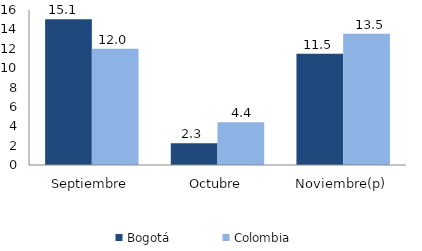
| Category | Bogotá | Colombia |
|---|---|---|
| Septiembre | 15.057 | 11.994 |
| Octubre | 2.254 | 4.408 |
| Noviembre(p) | 11.491 | 13.546 |